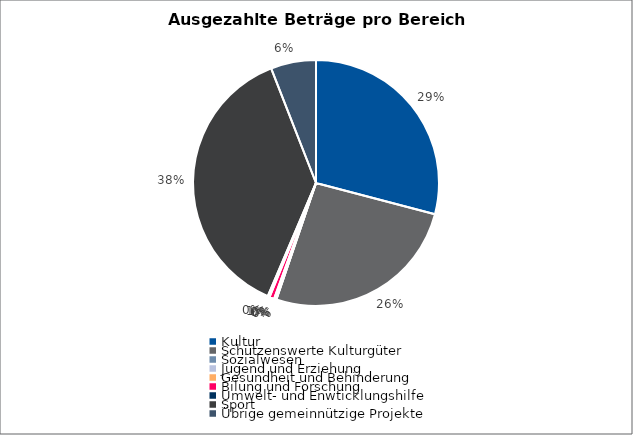
| Category | Series 0 |
|---|---|
| Kultur | 783454.13 |
| Schützenswerte Kulturgüter | 704117.25 |
| Sozialwesen | 0 |
| Jugend und Erziehung | 6500 |
| Gesundheit und Behinderung | 1500 |
| Bilung und Forschung | 17000 |
| Umwelt- und Enwticklungshilfe | 7000 |
| Sport | 1014177.67 |
| Übrige gemeinnützige Projekte | 160000 |